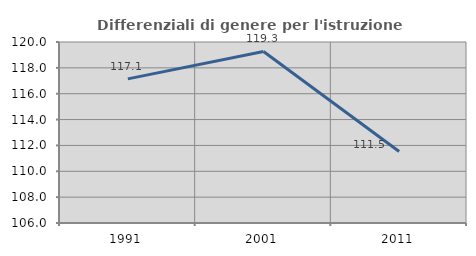
| Category | Differenziali di genere per l'istruzione superiore |
|---|---|
| 1991.0 | 117.149 |
| 2001.0 | 119.266 |
| 2011.0 | 111.528 |